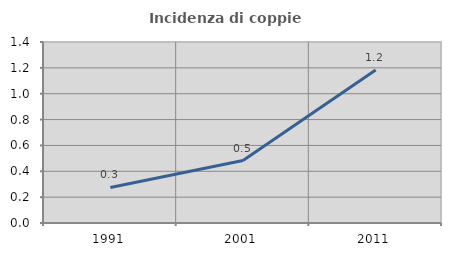
| Category | Incidenza di coppie miste |
|---|---|
| 1991.0 | 0.275 |
| 2001.0 | 0.483 |
| 2011.0 | 1.183 |